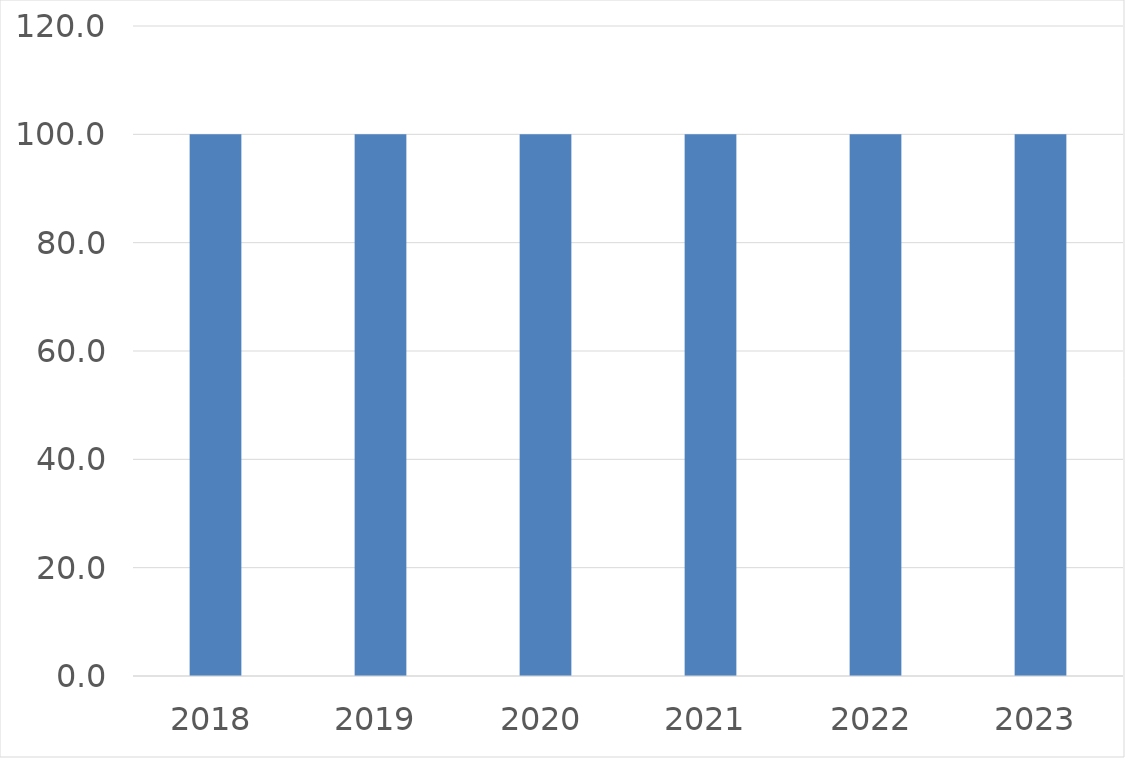
| Category | Series 0 |
|---|---|
| 2018 | 100 |
| 2019 | 100 |
| 2020 | 100 |
| 2021 | 100 |
| 2022 | 100 |
| 2023 | 100 |